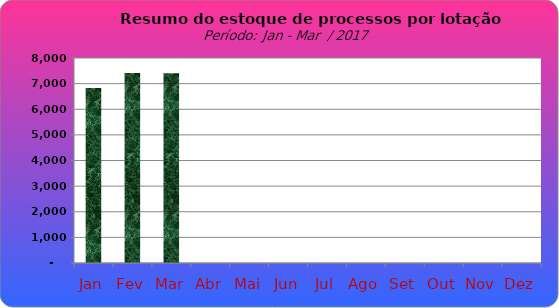
| Category | Series 0 |
|---|---|
| Jan | 6829 |
| Fev | 7414 |
| Mar | 7401 |
| Abr | 0 |
| Mai | 0 |
| Jun | 0 |
| Jul | 0 |
| Ago | 0 |
| Set | 0 |
| Out | 0 |
| Nov | 0 |
| Dez | 0 |